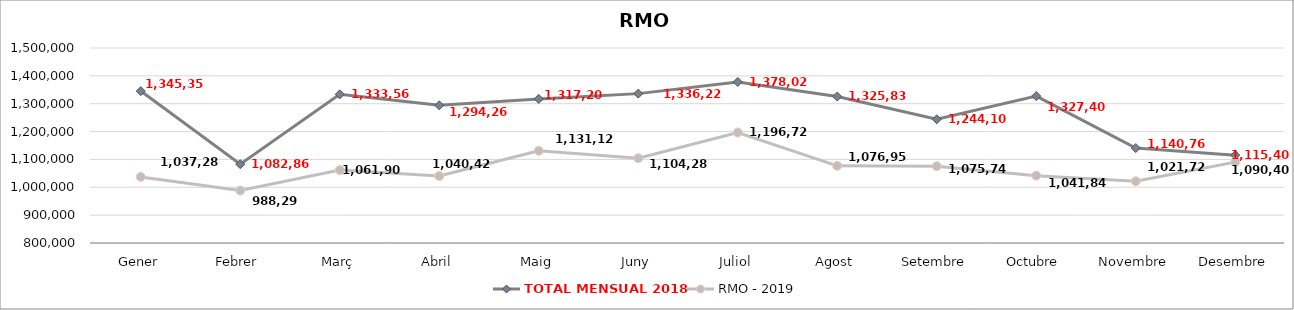
| Category | TOTAL MENSUAL 2018 | RMO - 2019 |
|---|---|---|
| Gener | 1345359 | 1037280.01 |
| Febrer | 1082860 | 988299 |
| Març | 1333560 | 1061900 |
| Abril | 1294260 | 1040420 |
| Maig | 1317200 | 1131120 |
| Juny | 1336220 | 1104280 |
| Juliol | 1378020 | 1196720 |
| Agost | 1325839 | 1076958.82 |
| Setembre | 1244100 | 1075740 |
| Octubre | 1327400 | 1041840 |
| Novembre | 1140760 | 1021720 |
| Desembre | 1115400 | 1090399.99 |